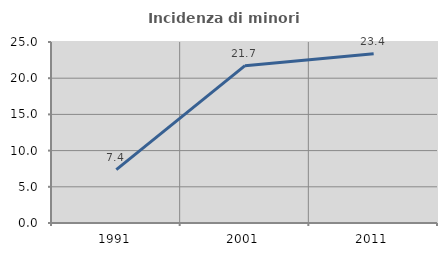
| Category | Incidenza di minori stranieri |
|---|---|
| 1991.0 | 7.383 |
| 2001.0 | 21.735 |
| 2011.0 | 23.388 |